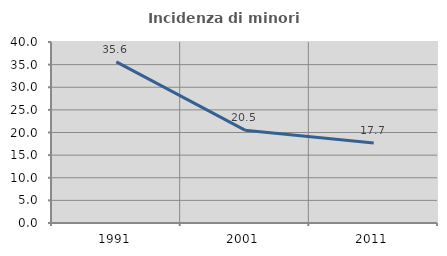
| Category | Incidenza di minori stranieri |
|---|---|
| 1991.0 | 35.616 |
| 2001.0 | 20.513 |
| 2011.0 | 17.672 |